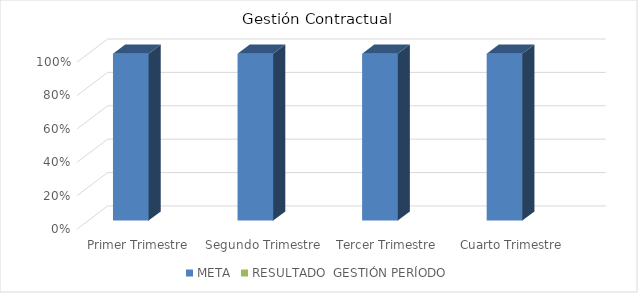
| Category | META | RESULTADO  GESTIÓN PERÍODO |
|---|---|---|
| Primer Trimestre | 1 |  |
| Segundo Trimestre | 1 |  |
| Tercer Trimestre | 1 |  |
| Cuarto Trimestre | 1 |  |